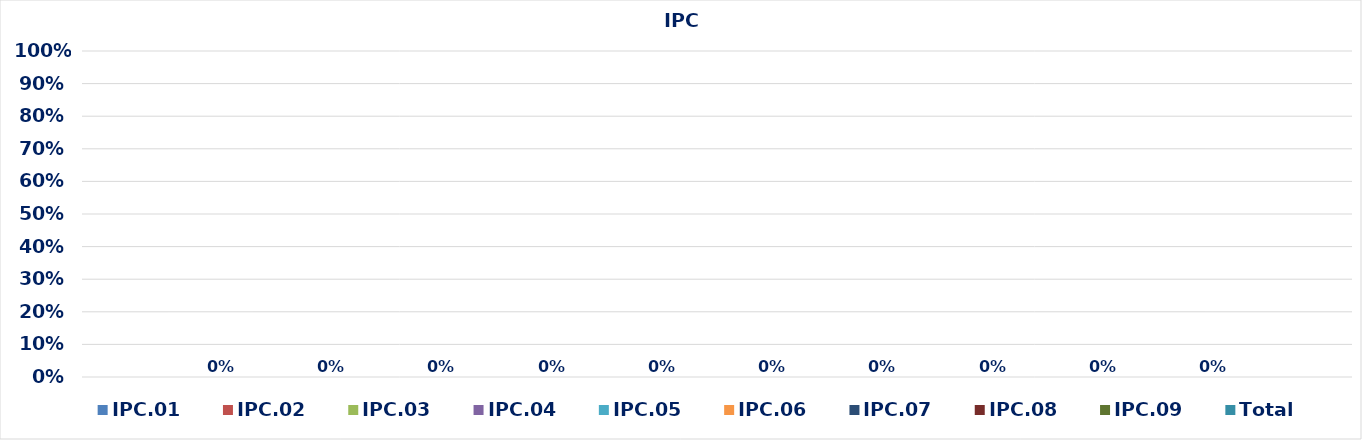
| Category | IPC.01 | IPC.02 | IPC.03 | IPC.04 | IPC.05 | IPC.06 | IPC.07 | IPC.08 | IPC.09 | Total |
|---|---|---|---|---|---|---|---|---|---|---|
| 0 | 0 | 0 | 0 | 0 | 0 | 0 | 0 | 0 | 0 | 0 |